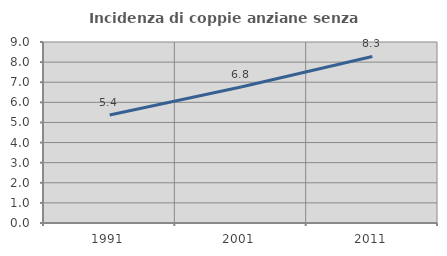
| Category | Incidenza di coppie anziane senza figli  |
|---|---|
| 1991.0 | 5.366 |
| 2001.0 | 6.764 |
| 2011.0 | 8.281 |